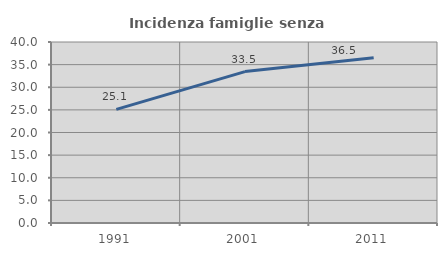
| Category | Incidenza famiglie senza nuclei |
|---|---|
| 1991.0 | 25.103 |
| 2001.0 | 33.46 |
| 2011.0 | 36.536 |